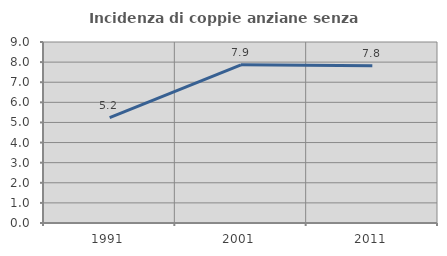
| Category | Incidenza di coppie anziane senza figli  |
|---|---|
| 1991.0 | 5.242 |
| 2001.0 | 7.863 |
| 2011.0 | 7.817 |